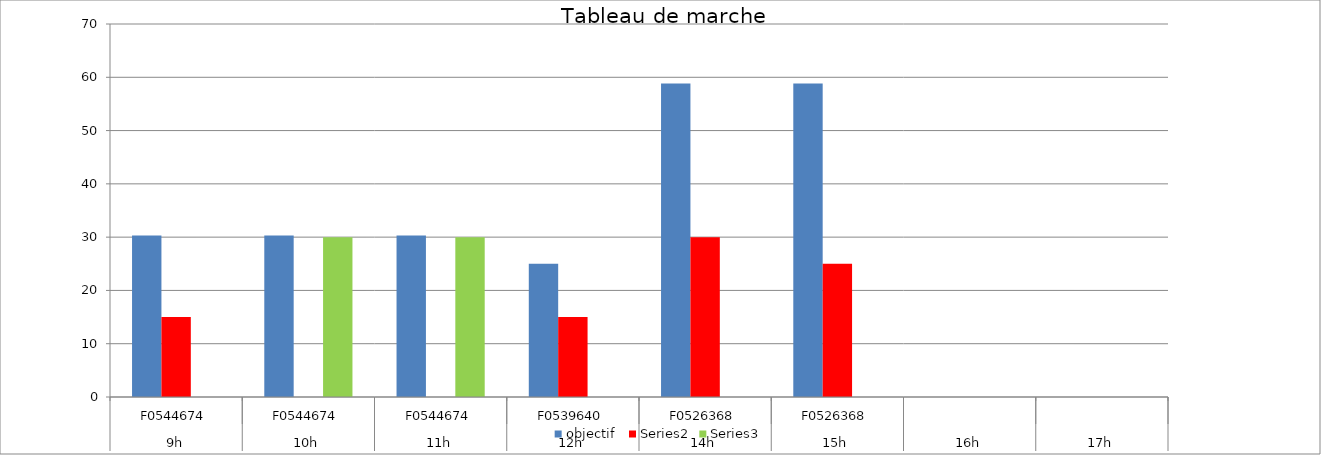
| Category | objectif  | Series 2 | Series 3 |
|---|---|---|---|
| 0 | 30.303 | 15 | 0 |
| 1 | 30.303 | 0 | 30 |
| 2 | 30.303 | 0 | 30 |
| 3 | 25 | 15 | 0 |
| 4 | 58.824 | 30 | 0 |
| 5 | 58.824 | 25 | 0 |
| 6 | 0 | 0 | 0 |
| 7 | 0 | 0 | 0 |